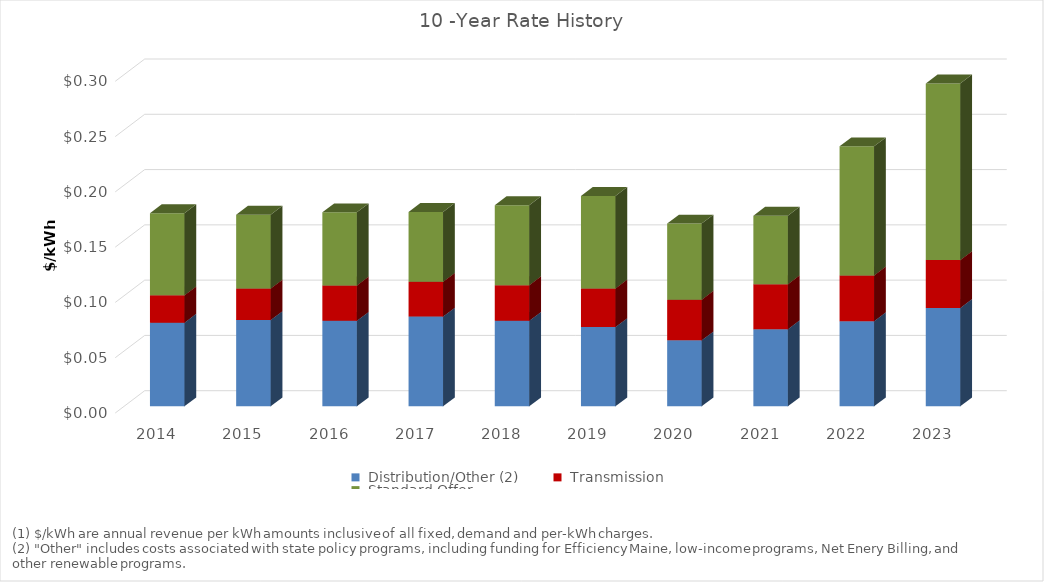
| Category | Series 1 | Series 2 | Series 3 |
|---|---|---|---|
| 2014.0 | 0.076 | 0.025 | 0.074 |
| 2015.0 | 0.078 | 0.028 | 0.067 |
| 2016.0 | 0.077 | 0.032 | 0.066 |
| 2017.0 | 0.081 | 0.031 | 0.063 |
| 2018.0 | 0.077 | 0.032 | 0.072 |
| 2019.0 | 0.072 | 0.035 | 0.084 |
| 2020.0 | 0.06 | 0.037 | 0.069 |
| 2021.0 | 0.07 | 0.041 | 0.062 |
| 2022.0 | 0.077 | 0.041 | 0.117 |
| 2023.0 | 0.089 | 0.043 | 0.16 |